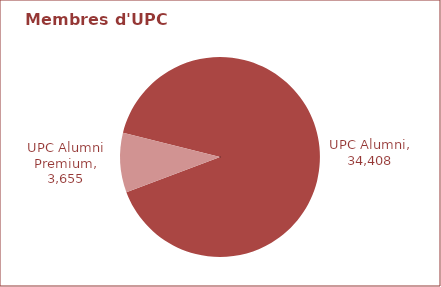
| Category | Series 0 |
|---|---|
| UPC Alumni | 34408 |
| UPC Alumni Premium | 3655 |